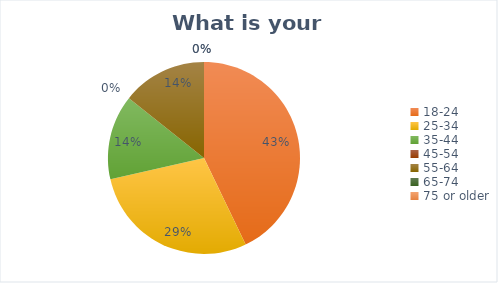
| Category | Series 0 |
|---|---|
| 18-24 | 3 |
| 25-34 | 2 |
| 35-44 | 1 |
| 45-54 | 0 |
| 55-64 | 1 |
| 65-74 | 0 |
| 75 or older | 0 |